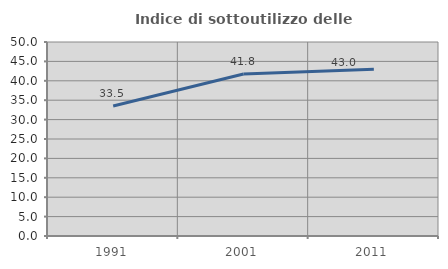
| Category | Indice di sottoutilizzo delle abitazioni  |
|---|---|
| 1991.0 | 33.492 |
| 2001.0 | 41.766 |
| 2011.0 | 42.955 |